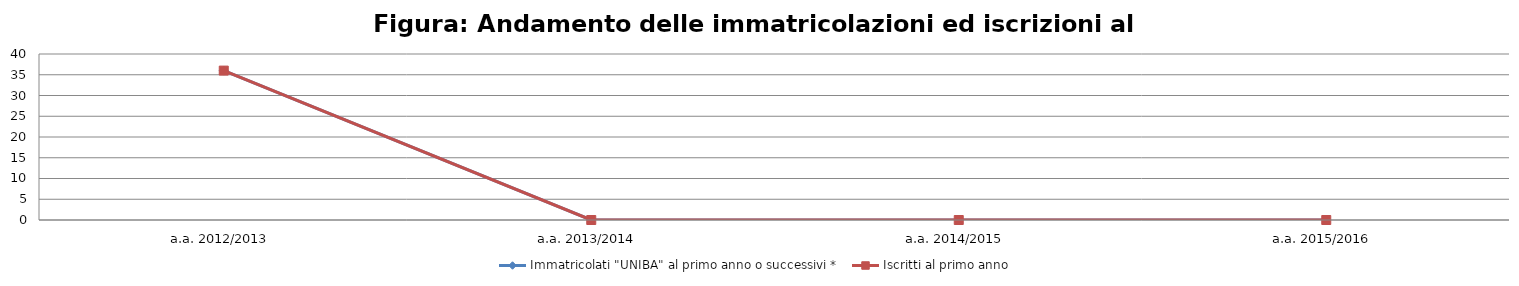
| Category | Immatricolati "UNIBA" al primo anno o successivi * | Iscritti al primo anno  |
|---|---|---|
| a.a. 2012/2013 | 36 | 36 |
| a.a. 2013/2014 | 0 | 0 |
| a.a. 2014/2015 | 0 | 0 |
| a.a. 2015/2016 | 0 | 0 |